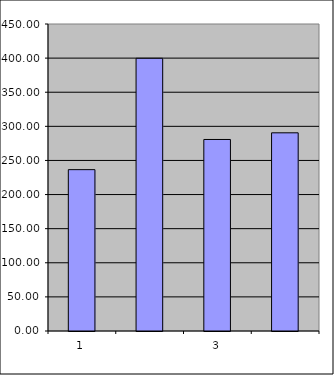
| Category | Series 0 |
|---|---|
| 0 | 236.5 |
| 1 | 399.712 |
| 2 | 280.737 |
| 3 | 290.485 |